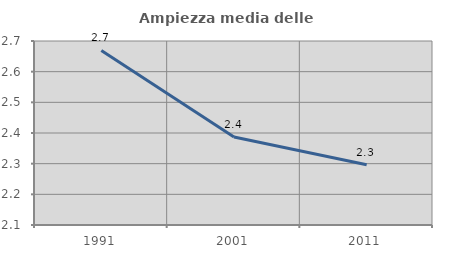
| Category | Ampiezza media delle famiglie |
|---|---|
| 1991.0 | 2.669 |
| 2001.0 | 2.387 |
| 2011.0 | 2.297 |